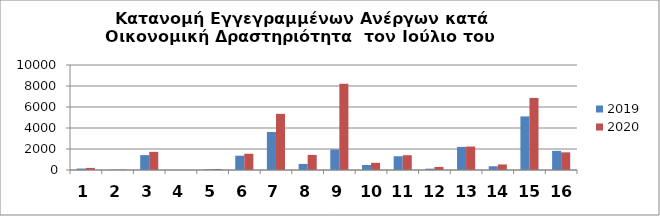
| Category | 2019 | 2020 |
|---|---|---|
| 0 | 138 | 199 |
| 1 | 32 | 37 |
| 2 | 1418 | 1728 |
| 3 | 11 | 14 |
| 4 | 65 | 97 |
| 5 | 1363 | 1549 |
| 6 | 3623 | 5347 |
| 7 | 577 | 1437 |
| 8 | 1961 | 8216 |
| 9 | 475 | 682 |
| 10 | 1309 | 1407 |
| 11 | 126 | 290 |
| 12 | 2202 | 2234 |
| 13 | 355 | 528 |
| 14 | 5104 | 6866 |
| 15 | 1823 | 1682 |